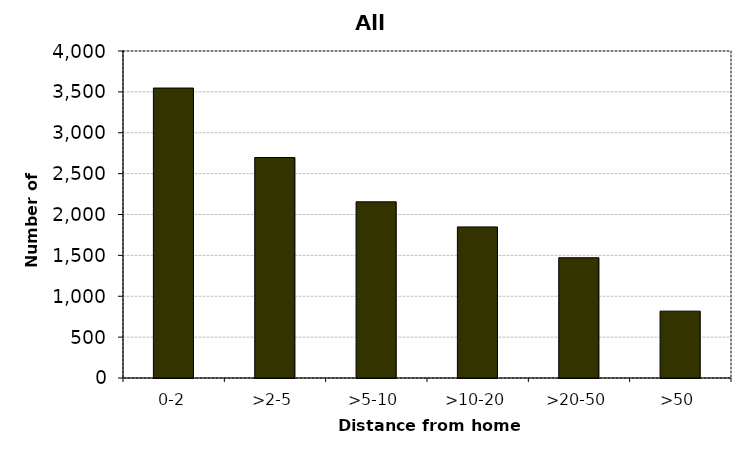
| Category | All drivers |
|---|---|
| 0-2 | 3547 |
| >2-5 | 2697 |
| >5-10 | 2155 |
| >10-20 | 1848 |
| >20-50 | 1471 |
| >50 | 818 |